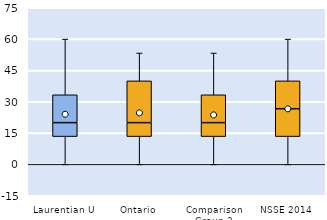
| Category | 25th | 50th | 75th |
|---|---|---|---|
| Laurentian U | 13.333 | 6.667 | 13.333 |
| Ontario | 13.333 | 6.667 | 20 |
| Comparison Group 2 | 13.333 | 6.667 | 13.333 |
| NSSE 2014 | 13.333 | 13.333 | 13.333 |